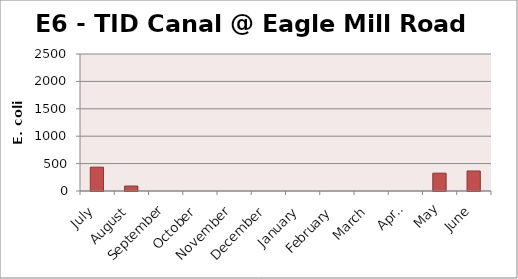
| Category | E. coli MPN |
|---|---|
| July | 435.2 |
| August | 90.9 |
| September | 0 |
| October | 0 |
| November | 0 |
| December | 0 |
| January | 0 |
| February | 0 |
| March | 0 |
| April | 0 |
| May | 325.5 |
| June | 365.4 |